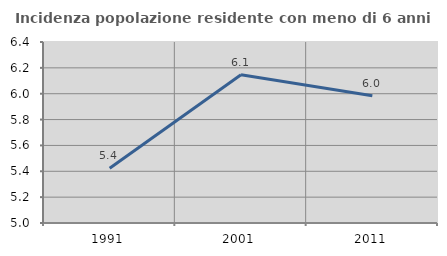
| Category | Incidenza popolazione residente con meno di 6 anni |
|---|---|
| 1991.0 | 5.423 |
| 2001.0 | 6.147 |
| 2011.0 | 5.984 |